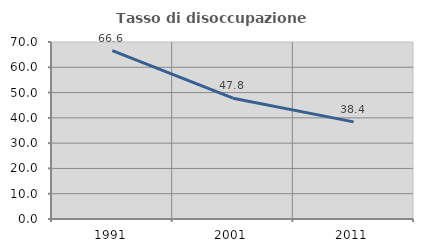
| Category | Tasso di disoccupazione giovanile  |
|---|---|
| 1991.0 | 66.583 |
| 2001.0 | 47.763 |
| 2011.0 | 38.416 |